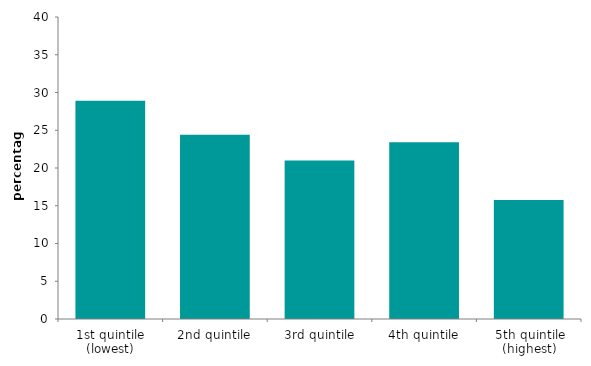
| Category | Series 0 |
|---|---|
| 1st quintile (lowest) | 28.908 |
| 2nd quintile | 24.409 |
| 3rd quintile | 21.008 |
| 4th quintile | 23.421 |
| 5th quintile (highest) | 15.754 |